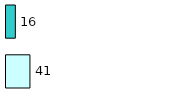
| Category | Series 0 | Series 1 |
|---|---|---|
| 0 | 41 | 16 |